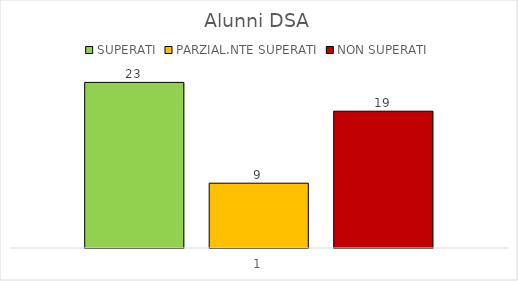
| Category | SUPERATI | PARZIAL.NTE SUPERATI | NON SUPERATI |
|---|---|---|---|
| 0 | 23 | 9 | 19 |